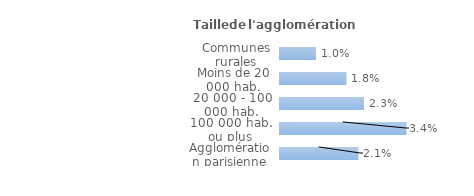
| Category | Series 0 |
|---|---|
| Communes rurales | 0.01 |
| Moins de 20 000 hab. | 0.018 |
| 20 000 - 100 000 hab. | 0.023 |
| 100 000 hab. ou plus | 0.034 |
| Agglomération parisienne | 0.021 |